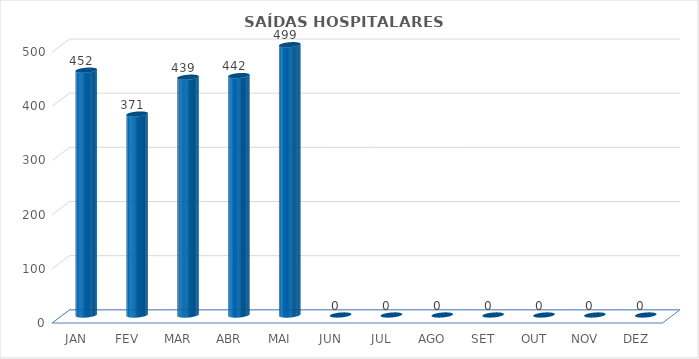
| Category | Series 0 |
|---|---|
| JAN | 452 |
| FEV | 371 |
| MAR | 439 |
| ABR | 442 |
| MAI | 499 |
| JUN | 0 |
| JUL | 0 |
| AGO | 0 |
| SET | 0 |
| OUT | 0 |
| NOV | 0 |
| DEZ | 0 |